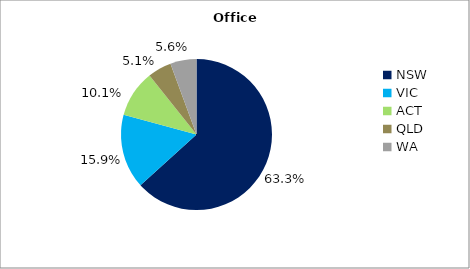
| Category | Series 0 |
|---|---|
| NSW | 0.633 |
| VIC | 0.159 |
| ACT | 0.101 |
| QLD | 0.051 |
| WA | 0.056 |